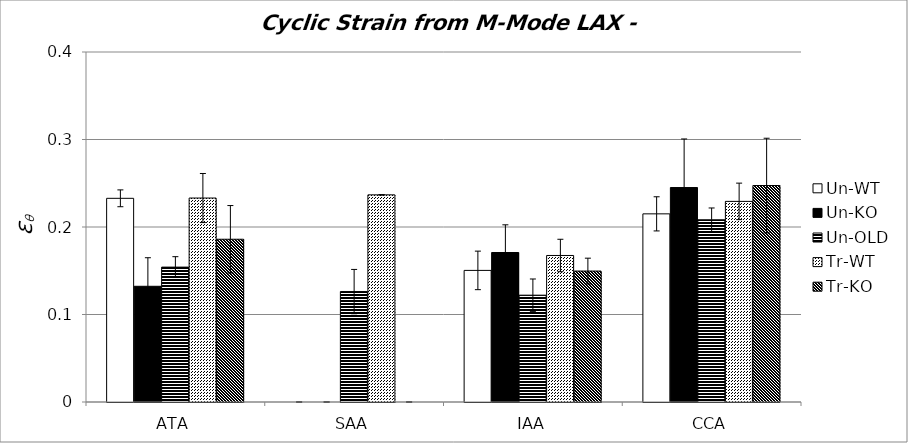
| Category | Un-WT | Un-KO | Un-OLD | Tr-WT | Tr-KO |
|---|---|---|---|---|---|
| 0 | 0.233 | 0.132 | 0.154 | 0.233 | 0.186 |
| 1 | 0 | 0 | 0.126 | 0.237 | 0 |
| 2 | 0.15 | 0.171 | 0.122 | 0.167 | 0.15 |
| 3 | 0.215 | 0.245 | 0.208 | 0.229 | 0.247 |